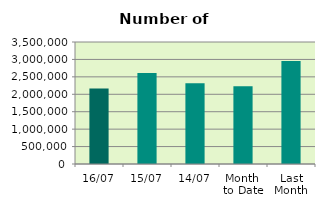
| Category | Series 0 |
|---|---|
| 16/07 | 2164944 |
| 15/07 | 2607122 |
| 14/07 | 2313144 |
| Month 
to Date | 2234099.667 |
| Last
Month | 2956123.091 |